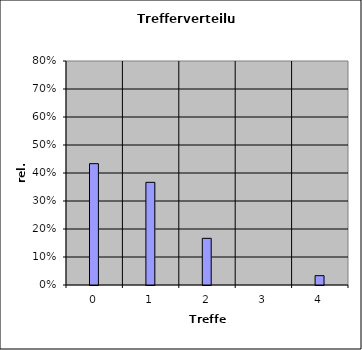
| Category | rel. Hfgk. |
|---|---|
| 0.0 | 0.433 |
| 1.0 | 0.367 |
| 2.0 | 0.167 |
| 3.0 | 0 |
| 4.0 | 0.033 |